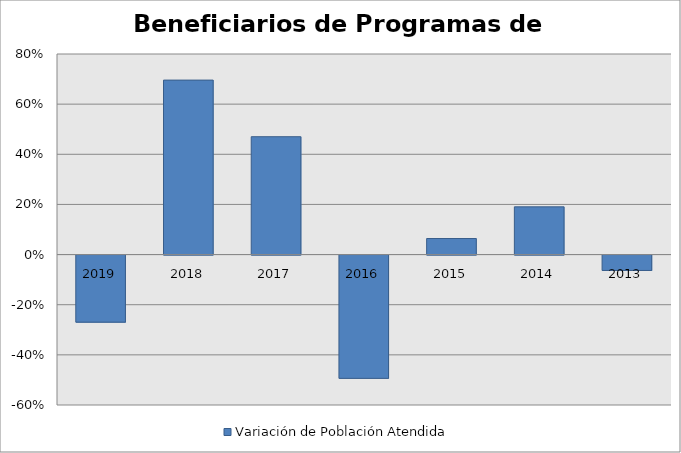
| Category | Variación de Población Atendida |
|---|---|
| 2019.0 | -0.268 |
| 2018.0 | 0.696 |
| 2017.0 | 0.47 |
| 2016.0 | -0.492 |
| 2015.0 | 0.064 |
| 2014.0 | 0.19 |
| 2013.0 | -0.061 |